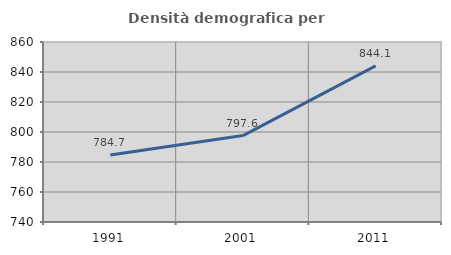
| Category | Densità demografica |
|---|---|
| 1991.0 | 784.731 |
| 2001.0 | 797.628 |
| 2011.0 | 844.099 |